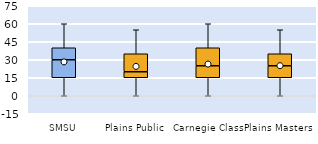
| Category | 25th | 50th | 75th |
|---|---|---|---|
| SMSU | 15 | 15 | 10 |
| Plains Public | 15 | 5 | 15 |
| Carnegie Class | 15 | 10 | 15 |
| Plains Masters | 15 | 10 | 10 |